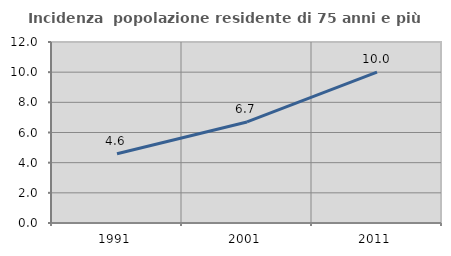
| Category | Incidenza  popolazione residente di 75 anni e più |
|---|---|
| 1991.0 | 4.594 |
| 2001.0 | 6.701 |
| 2011.0 | 10.001 |